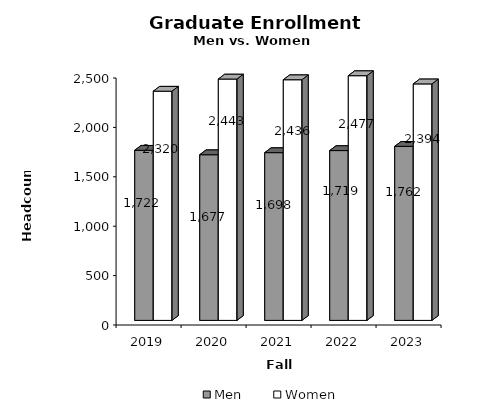
| Category | Men | Women |
|---|---|---|
| 2019.0 | 1722 | 2320 |
| 2020.0 | 1677 | 2443 |
| 2021.0 | 1698 | 2436 |
| 2022.0 | 1719 | 2477 |
| 2023.0 | 1762 | 2394 |